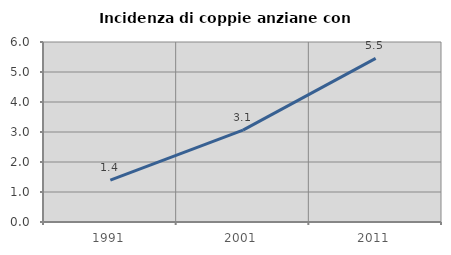
| Category | Incidenza di coppie anziane con figli |
|---|---|
| 1991.0 | 1.397 |
| 2001.0 | 3.061 |
| 2011.0 | 5.455 |